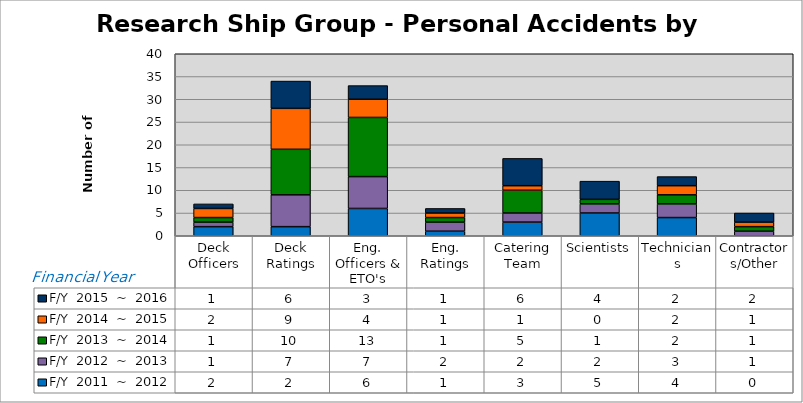
| Category | F/Y  2011  ~  2012 | F/Y  2012  ~  2013 | F/Y  2013  ~  2014 | F/Y  2014  ~  2015 | F/Y  2015  ~  2016 |
|---|---|---|---|---|---|
| Deck Officers | 2 | 1 | 1 | 2 | 1 |
| Deck Ratings | 2 | 7 | 10 | 9 | 6 |
| Eng. Officers & ETO's | 6 | 7 | 13 | 4 | 3 |
| Eng. Ratings | 1 | 2 | 1 | 1 | 1 |
| Catering Team | 3 | 2 | 5 | 1 | 6 |
| Scientists | 5 | 2 | 1 | 0 | 4 |
| Technicians | 4 | 3 | 2 | 2 | 2 |
| Contractors/Other | 0 | 1 | 1 | 1 | 2 |